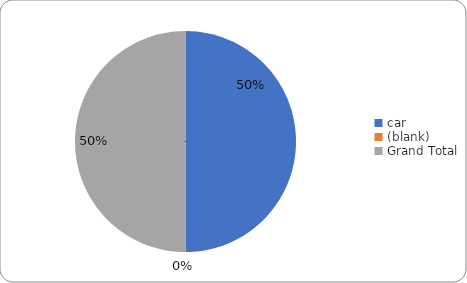
| Category | Sum of CO2 emissions (kg/year) |
|---|---|
| car | 2172 |
| (blank) | 0 |
| Grand Total | 2172 |